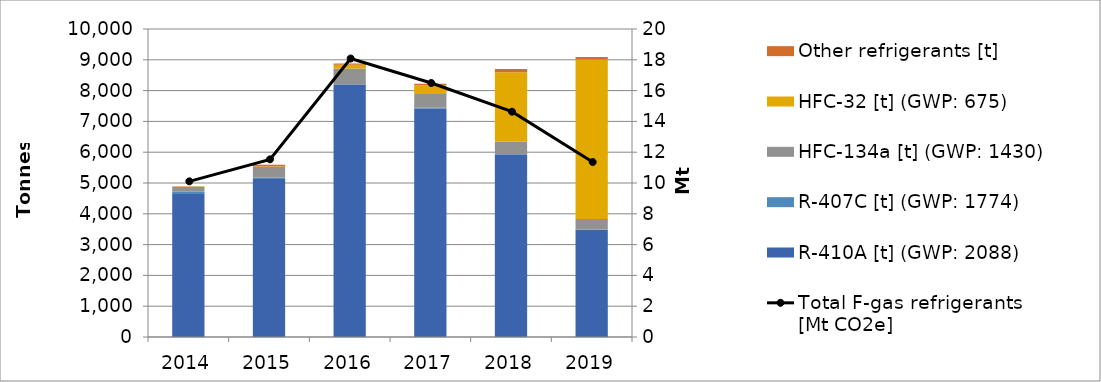
| Category | R-410A [t] (GWP: 2088) | R-407C [t] (GWP: 1774) | HFC-134a [t] (GWP: 1430) | HFC-32 [t] (GWP: 675) | Other refrigerants [t] |
|---|---|---|---|---|---|
| 2014.0 | 4644.756 | 71.342 | 163.869 | 3.401 | 12.878 |
| 2015.0 | 5133.255 | 44.658 | 338.654 | 16.063 | 60.635 |
| 2016.0 | 8180.686 | 22.786 | 516.395 | 118.541 | 38.708 |
| 2017.0 | 7420.141 | 19.661 | 453.561 | 284.094 | 46.965 |
| 2018.0 | 5926.152 | 17.371 | 403.326 | 2251.517 | 105.518 |
| 2019.0 | 3471.576 | 17.959 | 345.427 | 5174.448 | 79.347 |